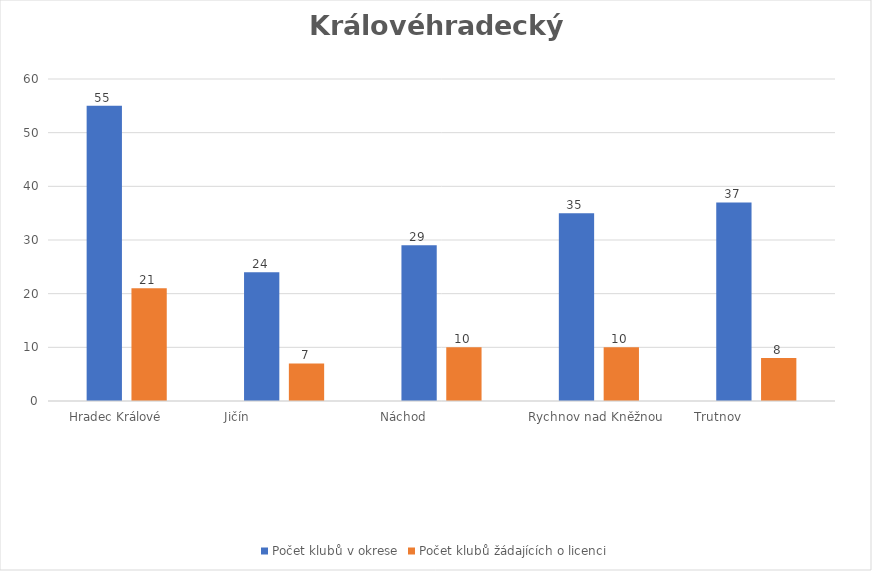
| Category | Počet klubů v okrese | Počet klubů žádajících o licenci |
|---|---|---|
| Hradec Králové      | 55 | 21 |
| Jičín                         | 24 | 7 |
| Náchod                    | 29 | 10 |
| Rychnov nad Kněžnou  | 35 | 10 |
| Trutnov                    | 37 | 8 |